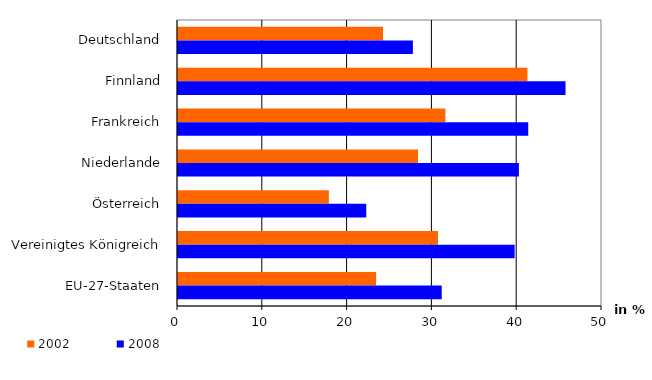
| Category | 2002 | 2008 |
|---|---|---|
| Deutschland | 24.177 | 27.7 |
| Finnland | 41.207 | 45.7 |
| Frankreich | 31.535 | 41.3 |
| Niederlande | 28.305 | 40.2 |
| Österreich | 17.79 | 22.2 |
| Vereinigtes Königreich | 30.655 | 39.7 |
| EU-27-Staaten | 23.363 | 31.1 |